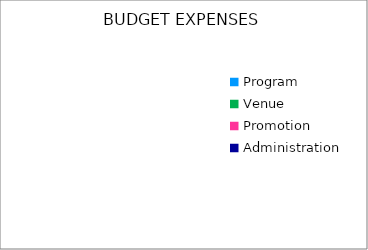
| Category | Series 0 |
|---|---|
| Program | 0 |
| Venue | 0 |
| Promotion | 0 |
| Administration | 0 |